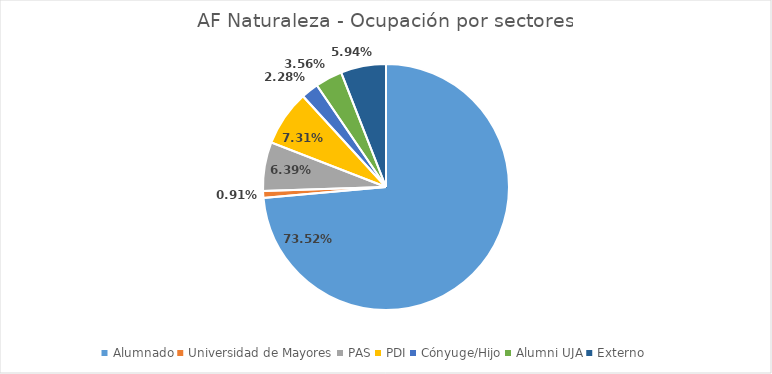
| Category | Series 0 |
|---|---|
| Alumnado | 0.735 |
| Universidad de Mayores | 0.009 |
| PAS | 0.064 |
| PDI | 0.073 |
| Cónyuge/Hijo | 0.023 |
| Alumni UJA | 0.036 |
| Externo | 0.059 |